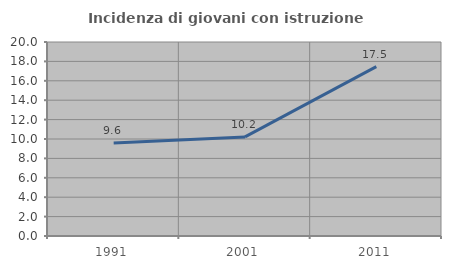
| Category | Incidenza di giovani con istruzione universitaria |
|---|---|
| 1991.0 | 9.589 |
| 2001.0 | 10.213 |
| 2011.0 | 17.46 |